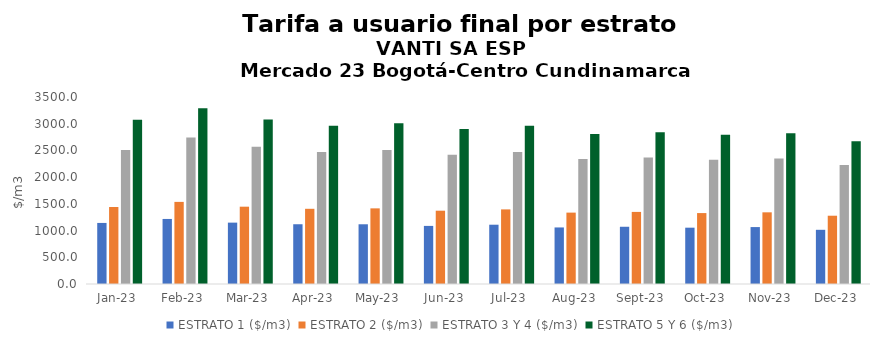
| Category | ESTRATO 1 ($/m3) | ESTRATO 2 ($/m3) | ESTRATO 3 Y 4 ($/m3) | ESTRATO 5 Y 6 ($/m3) |
|---|---|---|---|---|
| 2023-01-01 | 1142.83 | 1440.88 | 2506.69 | 3074.928 |
| 2023-02-01 | 1217.5 | 1536.84 | 2741.78 | 3290.136 |
| 2023-03-01 | 1148.64 | 1447.09 | 2567.53 | 3081.036 |
| 2023-04-01 | 1118.47 | 1407.56 | 2468.54 | 2962.248 |
| 2023-05-01 | 1117.85 | 1415.65 | 2506.69 | 3008.028 |
| 2023-06-01 | 1087.36 | 1371.98 | 2417.38 | 2900.856 |
| 2023-07-01 | 1109.69 | 1396.46 | 2468.54 | 2962.248 |
| 2023-08-01 | 1058.46 | 1336.01 | 2339.09 | 2806.908 |
| 2023-09-01 | 1071.3 | 1349.34 | 2366.44 | 2839.728 |
| 2023-10-01 | 1054.11 | 1327.47 | 2326.42 | 2791.704 |
| 2023-11-01 | 1065.47 | 1341.49 | 2350.92 | 2821.104 |
| 2023-12-01 | 1014.3 | 1278 | 2225.9 | 2671.08 |